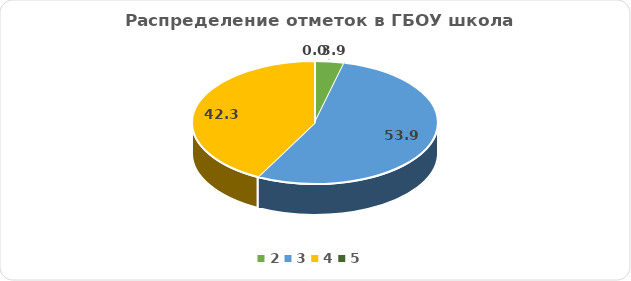
| Category | ГБОУ СОШ №500 |
|---|---|
| 2.0 | 3.85 |
| 3.0 | 53.85 |
| 4.0 | 42.31 |
| 5.0 | 0 |